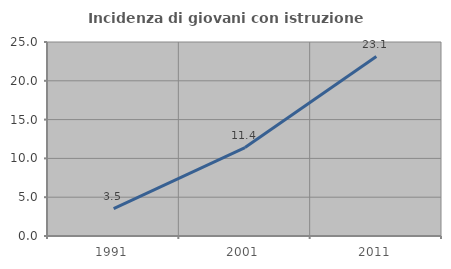
| Category | Incidenza di giovani con istruzione universitaria |
|---|---|
| 1991.0 | 3.54 |
| 2001.0 | 11.399 |
| 2011.0 | 23.121 |